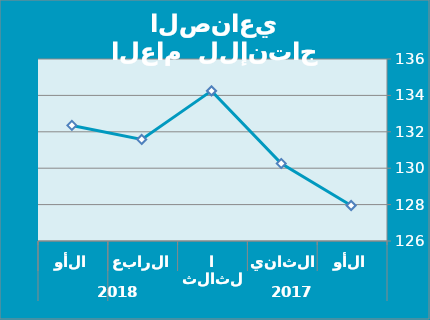
| Category | Series 0 |
|---|---|
| 0 | 127.95 |
| 1 | 130.26 |
| 2 | 134.25 |
| 3 | 131.58 |
| 4 | 132.35 |